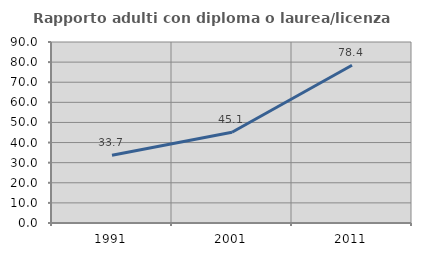
| Category | Rapporto adulti con diploma o laurea/licenza media  |
|---|---|
| 1991.0 | 33.735 |
| 2001.0 | 45.098 |
| 2011.0 | 78.44 |